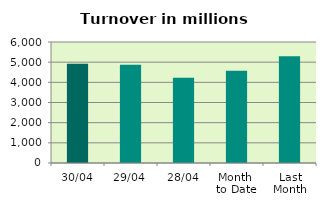
| Category | Series 0 |
|---|---|
| 30/04 | 4927.224 |
| 29/04 | 4868.905 |
| 28/04 | 4228.205 |
| Month 
to Date | 4573.802 |
| Last
Month | 5289.077 |